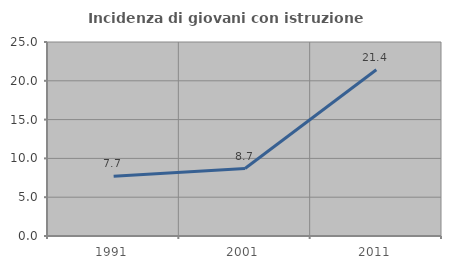
| Category | Incidenza di giovani con istruzione universitaria |
|---|---|
| 1991.0 | 7.692 |
| 2001.0 | 8.696 |
| 2011.0 | 21.429 |